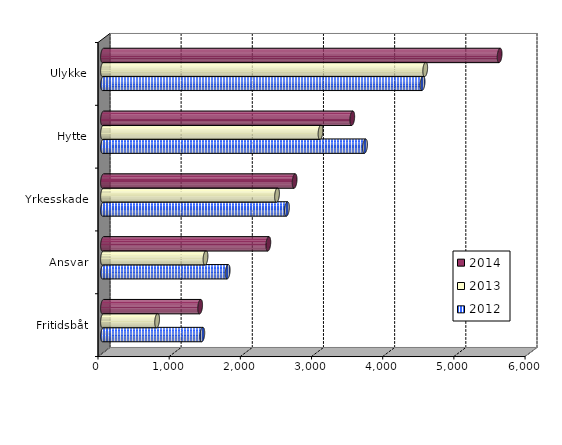
| Category | 2012 | 2013 | 2014 |
|---|---|---|---|
| Fritidsbåt | 1395.498 | 760.322 | 1365 |
| Ansvar | 1751.781 | 1440.347 | 2323 |
| Yrkesskade | 2584.187 | 2444.985 | 2692 |
| Hytte | 3681.274 | 3055.954 | 3502 |
| Ulykke | 4489.746 | 4526.895 | 5572.091 |